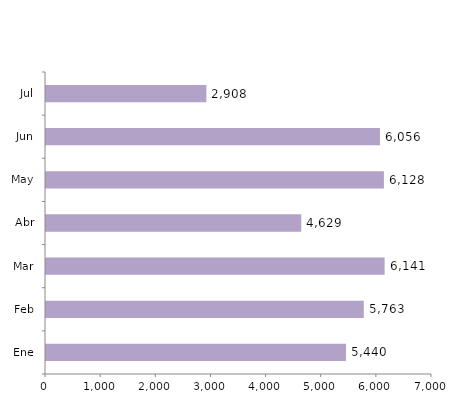
| Category | Series 0 |
|---|---|
| Ene | 5440 |
| Feb | 5763 |
| Mar | 6141 |
| Abr | 4629 |
| May | 6128 |
| Jun | 6056 |
| Jul | 2908 |